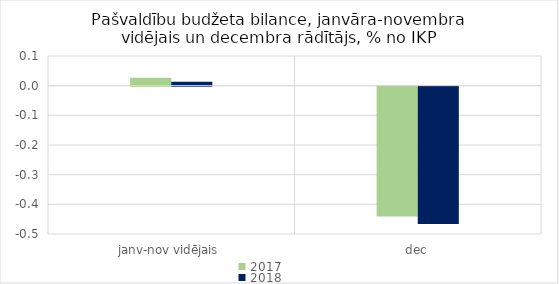
| Category | 2017 | 2018 |
|---|---|---|
| janv-nov vidējais | 0.027 | 0.014 |
| dec | -0.438 | -0.463 |